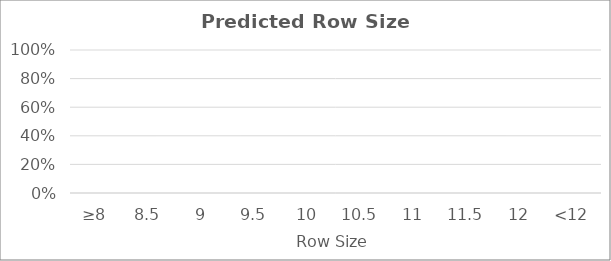
| Category | Percentage |
|---|---|
| ≥8 | 0 |
| 8.5 | 0 |
| 9 | 0 |
| 9.5 | 0 |
| 10 | 0 |
| 10.5 | 0 |
| 11 | 0 |
| 11.5 | 0 |
| 12 | 0 |
| <12 | 0 |